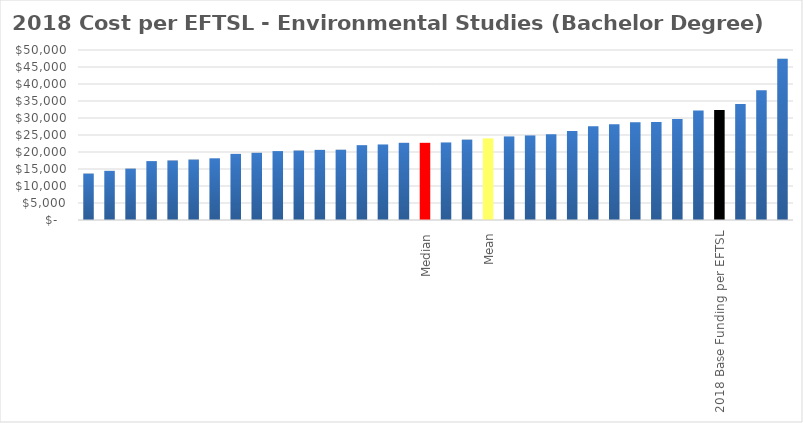
| Category | Series 0 |
|---|---|
|  | 13649.479 |
|  | 14456.923 |
|  | 15103.806 |
|  | 17323.514 |
|  | 17499.094 |
|  | 17773.872 |
|  | 18148.486 |
|  | 19449.273 |
|  | 19764.746 |
|  | 20268.466 |
|  | 20423.927 |
|  | 20624.446 |
|  | 20667.826 |
|  | 22009.781 |
|  | 22220.166 |
|  | 22699.407 |
| Median | 22699.407 |
|  | 22813.691 |
|  | 23634.404 |
| Mean | 24010.949 |
|  | 24581.846 |
|  | 24872.459 |
|  | 25185.536 |
|  | 26143.237 |
|  | 27587.713 |
|  | 28177.723 |
|  | 28770.805 |
|  | 28798.571 |
|  | 29707.58 |
|  | 32216.519 |
| 2018 Base Funding per EFTSL | 32336 |